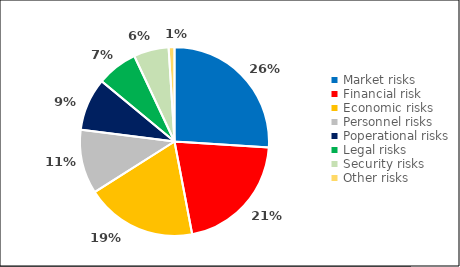
| Category | Column1 |
|---|---|
| Market risks | 0.26 |
| Financial risk | 0.21 |
| Economic risks | 0.19 |
| Personnel risks | 0.11 |
| Poperational risks | 0.09 |
| Legal risks | 0.07 |
| Security risks | 0.06 |
| Other risks | 0.01 |